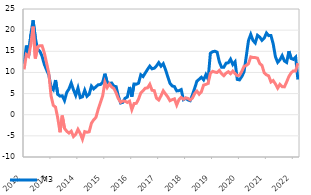
| Category | M3  | Domestic loans to the non-monetary sector |
|---|---|---|
| 2012-01-01 | 12.01 | 10.729 |
| 2012-02-01 | 16.354 | 14.221 |
| 2012-03-01 | 13.992 | 13.782 |
| 2012-04-01 | 18.952 | 16.69 |
| 2012-05-01 | 22.329 | 20.823 |
| 2012-06-01 | 18.134 | 13.296 |
| 2012-07-01 | 15.507 | 16.043 |
| 2012-08-01 | 15.015 | 16.313 |
| 2012-09-01 | 13.837 | 16.292 |
| 2012-10-01 | 11.912 | 14.641 |
| 2012-11-01 | 10.629 | 12.241 |
| 2012-12-01 | 9.421 | 9.834 |
| 2013-01-01 | 6.554 | 4.448 |
| 2013-02-01 | 5.916 | 2.211 |
| 2013-03-01 | 8.196 | 1.791 |
| 2013-04-01 | 4.809 | -0.816 |
| 2013-05-01 | 4.39 | -4.149 |
| 2013-06-01 | 4.482 | -0.203 |
| 2013-07-01 | 3.358 | -3.232 |
| 2013-08-01 | 5.277 | -3.913 |
| 2013-09-01 | 6.108 | -4.338 |
| 2013-10-01 | 7.502 | -3.897 |
| 2013-11-01 | 5.896 | -5.181 |
| 2013-12-01 | 4.573 | -4.65 |
| 2014-01-01 | 6.313 | -3.453 |
| 2014-02-01 | 4.038 | -4.43 |
| 2014-03-01 | 4.234 | -5.804 |
| 2014-04-01 | 5.797 | -3.993 |
| 2014-05-01 | 4.358 | -4.149 |
| 2014-06-01 | 4.845 | -4.035 |
| 2014-07-01 | 6.767 | -2.016 |
| 2014-08-01 | 6.108 | -1.198 |
| 2014-09-01 | 6.605 | -0.64 |
| 2014-10-01 | 7.075 | 1.254 |
| 2014-11-01 | 7.143 | 2.875 |
| 2014-12-01 | 7.648 | 4.423 |
| 2015-01-01 | 9.694 | 7.684 |
| 2015-02-01 | 7.639 | 6.418 |
| 2015-03-01 | 7.404 | 7.278 |
| 2015-04-01 | 7.508 | 6.557 |
| 2015-05-01 | 6.749 | 6.196 |
| 2015-06-01 | 6.629 | 5.14 |
| 2015-07-01 | 4.381 | 3.777 |
| 2015-08-01 | 2.769 | 2.956 |
| 2015-09-01 | 2.936 | 3.226 |
| 2015-10-01 | 3.902 | 3.199 |
| 2015-11-01 | 4.175 | 2.893 |
| 2015-12-01 | 6.564 | 3.196 |
| 2016-01-01 | 4.278 | 1.199 |
| 2016-02-01 | 7.267 | 2.638 |
| 2016-03-01 | 7.218 | 2.687 |
| 2016-04-01 | 7.458 | 3.711 |
| 2016-05-01 | 9.45 | 5.171 |
| 2016-06-01 | 9.03 | 5.69 |
| 2016-07-01 | 9.881 | 6.257 |
| 2016-08-01 | 10.715 | 6.355 |
| 2016-09-01 | 11.496 | 7.196 |
| 2016-10-01 | 10.853 | 5.785 |
| 2016-11-01 | 11.002 | 5.691 |
| 2016-12-01 | 11.553 | 3.906 |
| 2017-01-01 | 12.319 | 3.475 |
| 2017-02-01 | 11.489 | 4.47 |
| 2017-03-01 | 12.067 | 5.654 |
| 2017-04-01 | 10.696 | 4.923 |
| 2017-05-01 | 9.013 | 4.221 |
| 2017-06-01 | 7.423 | 3.312 |
| 2017-07-01 | 6.807 | 3.565 |
| 2017-08-01 | 6.642 | 3.755 |
| 2017-09-01 | 5.632 | 2.278 |
| 2017-10-01 | 5.691 | 3.574 |
| 2017-11-01 | 5.952 | 4.092 |
| 2017-12-01 | 3.567 | 3.671 |
| 2018-01-01 | 3.888 | 3.977 |
| 2018-02-01 | 3.511 | 3.859 |
| 2018-03-01 | 3.318 | 3.502 |
| 2018-04-01 | 4.689 | 3.934 |
| 2018-05-01 | 6.249 | 5.016 |
| 2018-06-01 | 7.929 | 5.586 |
| 2018-07-01 | 8.383 | 4.847 |
| 2018-08-01 | 8.861 | 5.412 |
| 2018-09-01 | 8.24 | 7.016 |
| 2018-10-31 | 9.483 | 7.163 |
| 2018-11-30 | 8.409 | 7.417 |
| 2018-12-31 | 14.522 | 9.795 |
| 2019-01-31 | 14.909 | 10.252 |
| 2019-02-28 | 15.018 | 10.086 |
| 2019-03-31 | 14.797 | 9.982 |
| 2019-04-30 | 12.506 | 10.464 |
| 2019-05-31 | 11.216 | 9.694 |
| 2019-06-30 | 11.23 | 9.224 |
| 2019-07-31 | 12.186 | 9.826 |
| 2019-08-31 | 12.279 | 10.177 |
| 2019-09-30 | 13.127 | 9.697 |
| 2019-10-31 | 11.864 | 10.311 |
| 2019-11-30 | 12.513 | 9.755 |
| 2019-12-31 | 8.354 | 9.245 |
| 2020-01-31 | 8.237 | 9.334 |
| 2020-02-29 | 9.035 | 10.229 |
| 2020-03-31 | 10.113 | 11.424 |
| 2020-04-30 | 13.811 | 11.641 |
| 2020-05-31 | 17.557 | 12.071 |
| 2020-06-30 | 18.995 | 13.679 |
| 2020-07-31 | 17.552 | 13.526 |
| 2020-08-31 | 16.965 | 13.505 |
| 2020-09-30 | 18.779 | 13.379 |
| 2020-10-31 | 18.356 | 12.108 |
| 2020-11-30 | 17.578 | 11.663 |
| 2020-12-31 | 18.105 | 9.901 |
| 2021-01-31 | 19.323 | 9.428 |
| 2021-02-28 | 18.702 | 9.17 |
| 2021-03-31 | 18.724 | 7.735 |
| 2021-04-30 | 16.749 | 8.079 |
| 2021-05-31 | 13.689 | 7.279 |
| 2021-06-30 | 12.386 | 6.275 |
| 2021-07-31 | 12.98 | 7.175 |
| 2021-08-31 | 13.971 | 6.618 |
| 2021-09-30 | 12.717 | 6.585 |
| 2021-10-31 | 12.354 | 7.764 |
| 2021-11-30 | 15.024 | 9.049 |
| 2021-12-31 | 13.293 | 9.904 |
| 2022-01-31 | 13.088 | 10.364 |
| 2022-02-28 | 13.628 | 10.35 |
| 2022-03-31 | 8.323 | 12.2 |